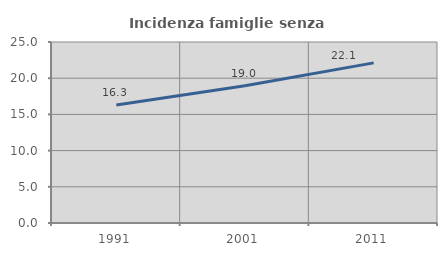
| Category | Incidenza famiglie senza nuclei |
|---|---|
| 1991.0 | 16.286 |
| 2001.0 | 18.952 |
| 2011.0 | 22.116 |